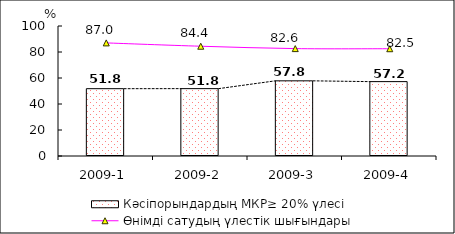
| Category | Кәсіпорындардың МКР≥ 20% үлесі |
|---|---|
| 2009-1 | 51.784 |
| 2009-2 | 51.826 |
| 2009-3 | 57.816 |
| 2009-4 | 57.213 |